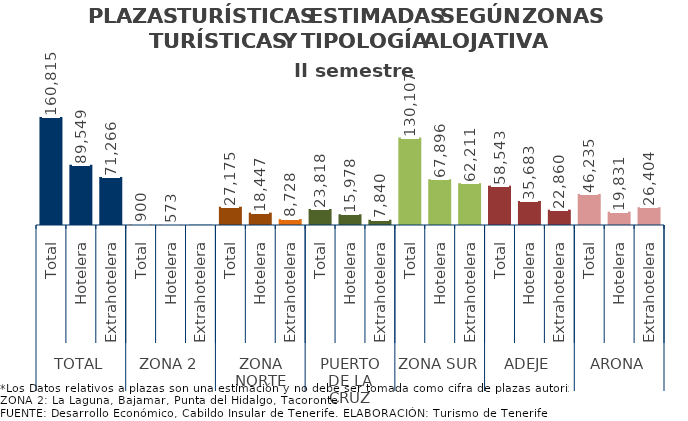
| Category | II semestre 2014 |
|---|---|
| 0 | 160815 |
| 1 | 89549 |
| 2 | 71266 |
| 3 | 900 |
| 4 | 573 |
| 5 | 327 |
| 6 | 27175 |
| 7 | 18447 |
| 8 | 8728 |
| 9 | 23818 |
| 10 | 15978 |
| 11 | 7840 |
| 12 | 130107 |
| 13 | 67896 |
| 14 | 62211 |
| 15 | 58543 |
| 16 | 35683 |
| 17 | 22860 |
| 18 | 46235 |
| 19 | 19831 |
| 20 | 26404 |